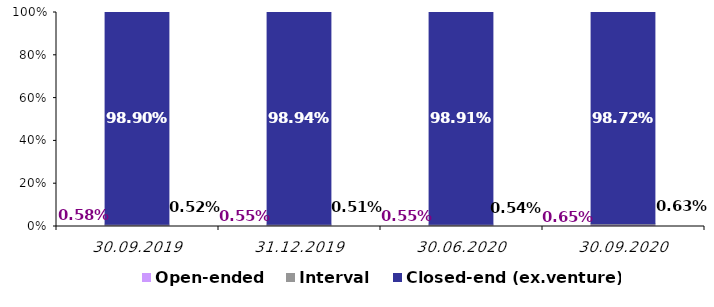
| Category | Open-ended | Interval | Closed-end (ex.venture) |
|---|---|---|---|
| 30.09.2019 | 0.006 | 0.005 | 0.989 |
| 31.12.2019 | 0.006 | 0.005 | 0.989 |
| 30.06.2020 | 0.005 | 0.005 | 0.989 |
| 30.09.2020 | 0.007 | 0.006 | 0.987 |